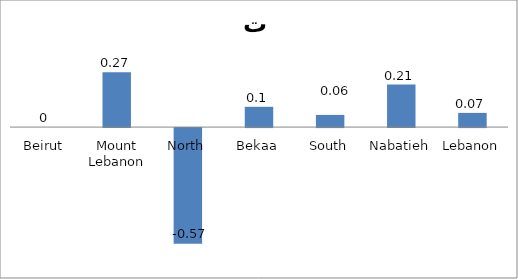
| Category | 08 |
|---|---|
| Beirut | 0 |
| Mount Lebanon | 0.27 |
| North | -0.57 |
| Bekaa | 0.1 |
| South | 0.06 |
| Nabatieh | 0.21 |
| Lebanon | 0.07 |